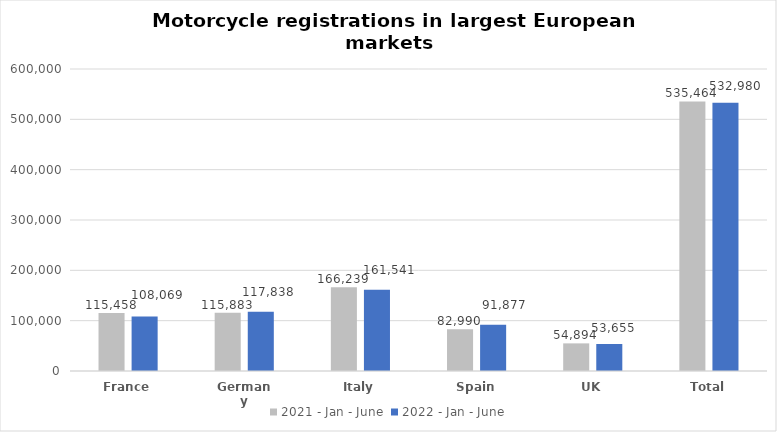
| Category | 2021 - Jan - June | 2022 - Jan - June |
|---|---|---|
| France | 115458 | 108069 |
| Germany | 115883 | 117838 |
| Italy | 166239 | 161541 |
| Spain | 82990 | 91877 |
| UK | 54894 | 53655 |
| Total | 535464 | 532980 |